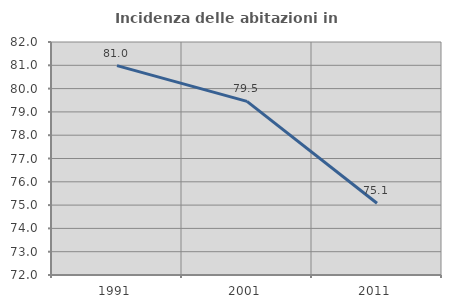
| Category | Incidenza delle abitazioni in proprietà  |
|---|---|
| 1991.0 | 80.986 |
| 2001.0 | 79.452 |
| 2011.0 | 75.08 |